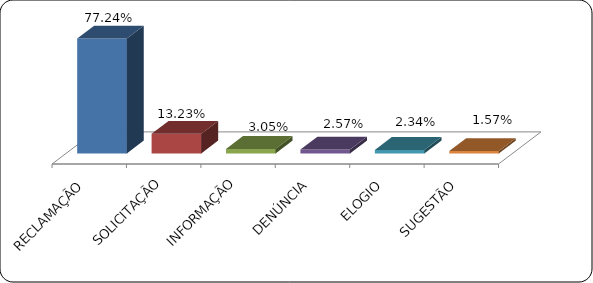
| Category | Series 0 |
|---|---|
|      RECLAMAÇÃO | 0.772 |
|      SOLICITAÇÃO | 0.132 |
|      INFORMAÇÃO | 0.03 |
|      DENÚNCIA | 0.026 |
|      ELOGIO | 0.023 |
|      SUGESTÃO | 0.016 |